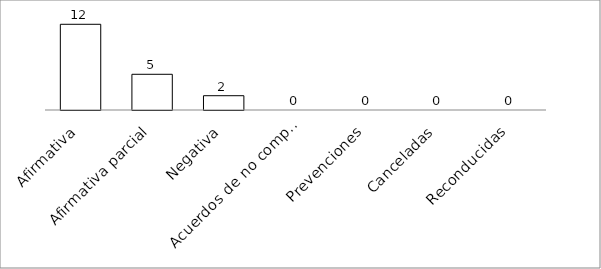
| Category | Series 0 |
|---|---|
| Afirmativa | 12 |
| Afirmativa parcial | 5 |
| Negativa | 2 |
| Acuerdos de no competencia | 0 |
| Prevenciones | 0 |
| Canceladas | 0 |
| Reconducidas | 0 |